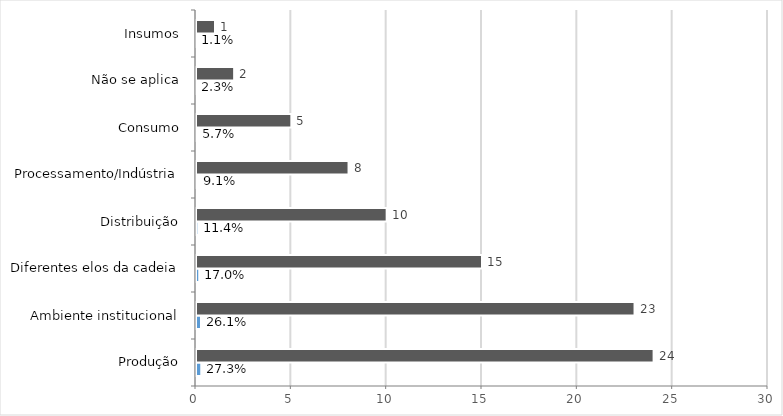
| Category | Series 0 | Series 1 |
|---|---|---|
| Produção | 0.273 | 24 |
| Ambiente institucional | 0.261 | 23 |
| Diferentes elos da cadeia | 0.17 | 15 |
| Distribuição | 0.114 | 10 |
| Processamento/Indústria | 0.091 | 8 |
| Consumo | 0.057 | 5 |
| Não se aplica | 0.023 | 2 |
| Insumos | 0.011 | 1 |